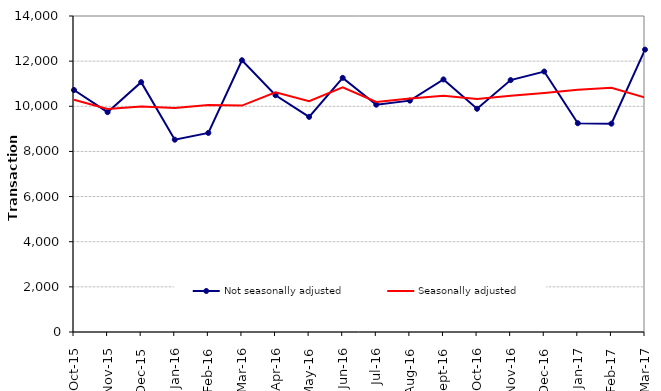
| Category | Not seasonally adjusted | Seasonally adjusted |
|---|---|---|
| 2015-10-01 | 10720 | 10290 |
| 2015-11-01 | 9740 | 9880 |
| 2015-12-01 | 11070 | 9990 |
| 2016-01-01 | 8520 | 9920 |
| 2016-02-01 | 8820 | 10060 |
| 2016-03-01 | 12040 | 10030 |
| 2016-04-01 | 10490 | 10620 |
| 2016-05-01 | 9530 | 10230 |
| 2016-06-01 | 11260 | 10840 |
| 2016-07-01 | 10070 | 10190 |
| 2016-08-01 | 10250 | 10340 |
| 2016-09-01 | 11190 | 10470 |
| 2016-10-01 | 9890 | 10320 |
| 2016-11-01 | 11160 | 10470 |
| 2016-12-01 | 11540 | 10590 |
| 2017-01-01 | 9250 | 10730 |
| 2017-02-01 | 9230 | 10820 |
| 2017-03-01 | 12510 | 10390 |